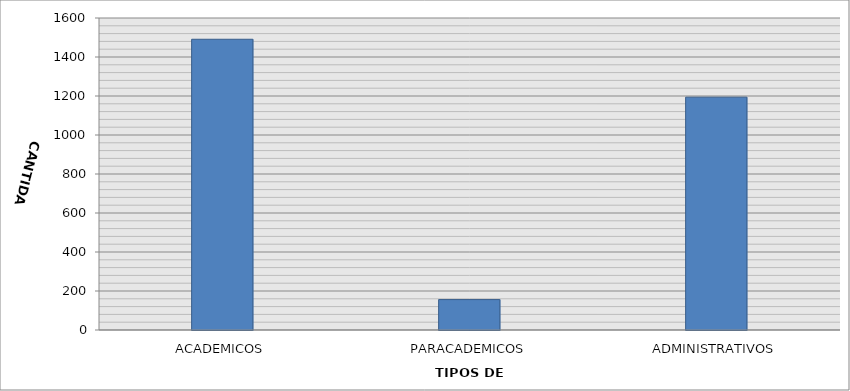
| Category | CANTIDAD |
|---|---|
| ACADEMICOS | 1491 |
| PARACADEMICOS | 156 |
| ADMINISTRATIVOS | 1194 |